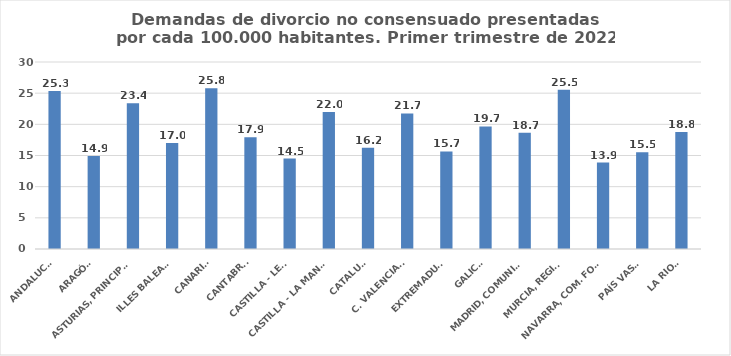
| Category | Series 0 |
|---|---|
| ANDALUCÍA | 25.341 |
| ARAGÓN | 14.94 |
| ASTURIAS, PRINCIPADO | 23.395 |
| ILLES BALEARS | 17.003 |
| CANARIAS | 25.776 |
| CANTABRIA | 17.942 |
| CASTILLA - LEÓN | 14.514 |
| CASTILLA - LA MANCHA | 21.976 |
| CATALUÑA | 16.227 |
| C. VALENCIANA | 21.745 |
| EXTREMADURA | 15.651 |
| GALICIA | 19.672 |
| MADRID, COMUNIDAD | 18.667 |
| MURCIA, REGIÓN | 25.532 |
| NAVARRA, COM. FORAL | 13.864 |
| PAÍS VASCO | 15.54 |
| LA RIOJA | 18.78 |